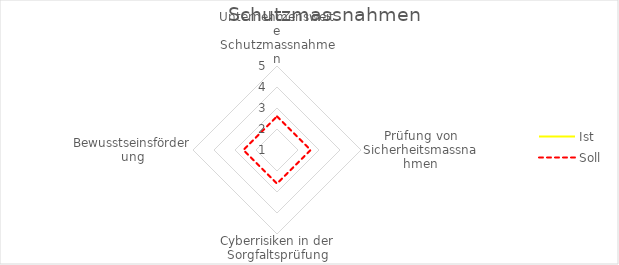
| Category | Ist | Soll |
|---|---|---|
| Unternehmensweite Schutzmassnahmen | 1 | 2.6 |
| Prüfung von Sicherheitsmassnahmen | 1 | 2.6 |
| Cyberrisiken in der Sorgfaltsprüfung | 1 | 2.6 |
| Bewusstseinsförderung | 1 | 2.6 |